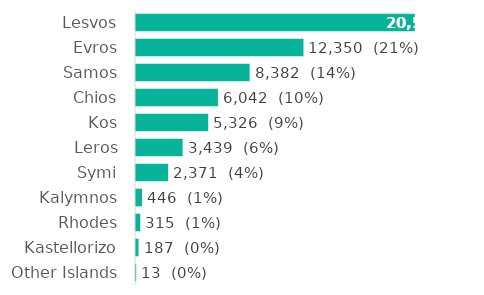
| Category | Series 0 |
|---|---|
| Lesvos | 20562 |
| Evros | 12350 |
| Samos | 8382 |
| Chios | 6042 |
| Kos | 5326 |
| Leros | 3439 |
| Symi | 2371 |
| Kalymnos | 446 |
| Rhodes | 315 |
| Kastellorizo | 187 |
| Other Islands | 13 |